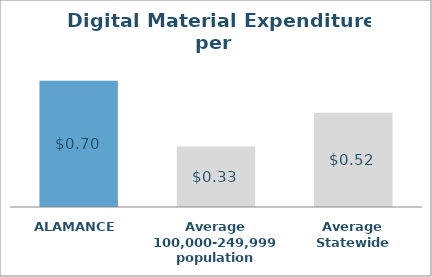
| Category | Series 0 |
|---|---|
| ALAMANCE | 0.696 |
| Average 100,000-249,999 population | 0.334 |
| Average Statewide | 0.519 |